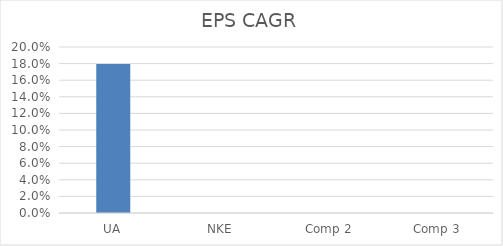
| Category | EPS CAGR |
|---|---|
| UA | 0.179 |
| NKE | 0 |
| Comp 2 | 0 |
| Comp 3 | 0 |